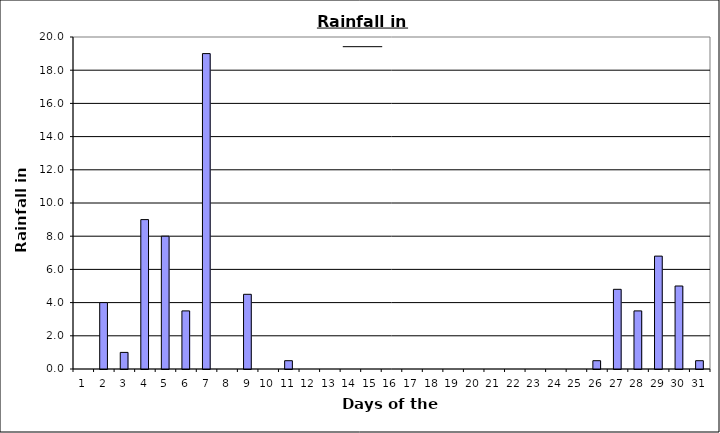
| Category | Series 0 |
|---|---|
| 0 | 0 |
| 1 | 4 |
| 2 | 1 |
| 3 | 9 |
| 4 | 8 |
| 5 | 3.5 |
| 6 | 19 |
| 7 | 0 |
| 8 | 4.5 |
| 9 | 0 |
| 10 | 0.5 |
| 11 | 0 |
| 12 | 0 |
| 13 | 0 |
| 14 | 0 |
| 15 | 0 |
| 16 | 0 |
| 17 | 0 |
| 18 | 0 |
| 19 | 0 |
| 20 | 0 |
| 21 | 0 |
| 22 | 0 |
| 23 | 0 |
| 24 | 0 |
| 25 | 0.5 |
| 26 | 4.8 |
| 27 | 3.5 |
| 28 | 6.8 |
| 29 | 5 |
| 30 | 0.5 |